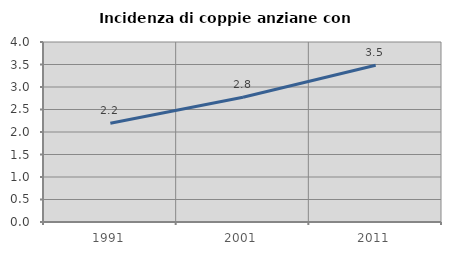
| Category | Incidenza di coppie anziane con figli |
|---|---|
| 1991.0 | 2.194 |
| 2001.0 | 2.771 |
| 2011.0 | 3.482 |